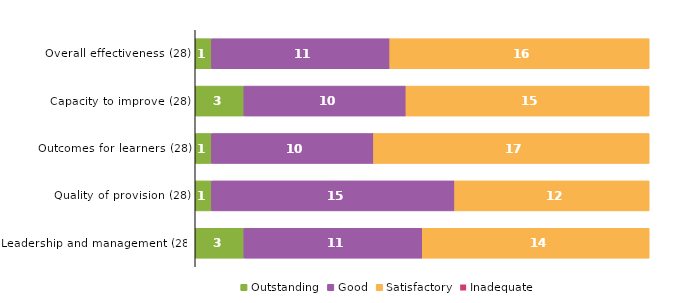
| Category | Outstanding | Good | Satisfactory | Inadequate |
|---|---|---|---|---|
| Overall effectiveness (28) | 1 | 11 | 16 | 0 |
| Capacity to improve (28) | 3 | 10 | 15 | 0 |
| Outcomes for learners (28) | 1 | 10 | 17 | 0 |
| Quality of provision (28) | 1 | 15 | 12 | 0 |
| Leadership and management (28) | 3 | 11 | 14 | 0 |